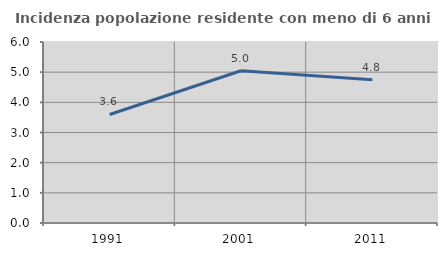
| Category | Incidenza popolazione residente con meno di 6 anni |
|---|---|
| 1991.0 | 3.597 |
| 2001.0 | 5.048 |
| 2011.0 | 4.752 |